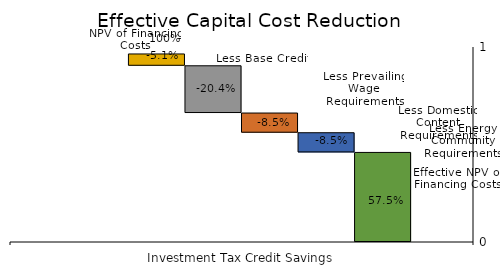
| Category | Effective NPV of Financing Costs | Less Energy Community Requirements | Less Domestic Content Requirements | Less Prevailing Wage Requirements | Less Base Credit | NPV of Financing Costs |
|---|---|---|---|---|---|---|
| 0 | 459369.164 | 100980.34 | 100980.34 | 242352.815 | 60588.204 | 0 |